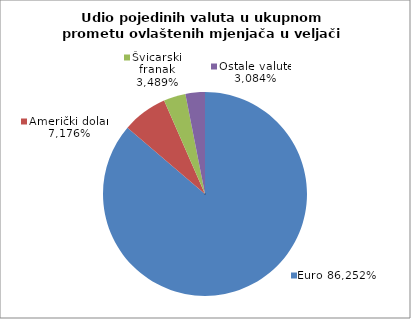
| Category | EUR |
|---|---|
| 0 | 0.863 |
| 1 | 0.072 |
| 2 | 0.035 |
| 3 | 0.031 |